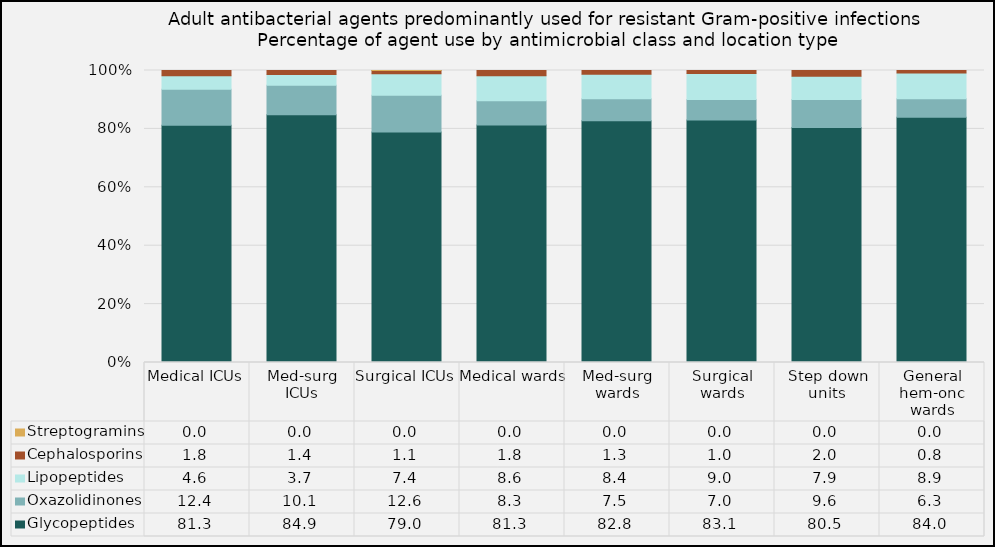
| Category | Glycopeptides | Oxazolidinones | Lipopeptides | Cephalosporins | Streptogramins |
|---|---|---|---|---|---|
| Medical ICUs | 81.26 | 12.37 | 4.59 | 1.79 | 0 |
| Med-surg ICUs | 84.86 | 10.12 | 3.65 | 1.37 | 0 |
| Surgical ICUs | 78.95 | 12.58 | 7.36 | 1.09 | 0.01 |
| Medical wards | 81.33 | 8.31 | 8.57 | 1.78 | 0 |
| Med-surg wards | 82.82 | 7.53 | 8.39 | 1.27 | 0 |
| Surgical wards | 83.07 | 6.96 | 8.96 | 1.01 | 0 |
| Step down units | 80.51 | 9.57 | 7.92 | 2.01 | 0 |
| General hem-onc wards | 84.01 | 6.28 | 8.88 | 0.83 | 0 |